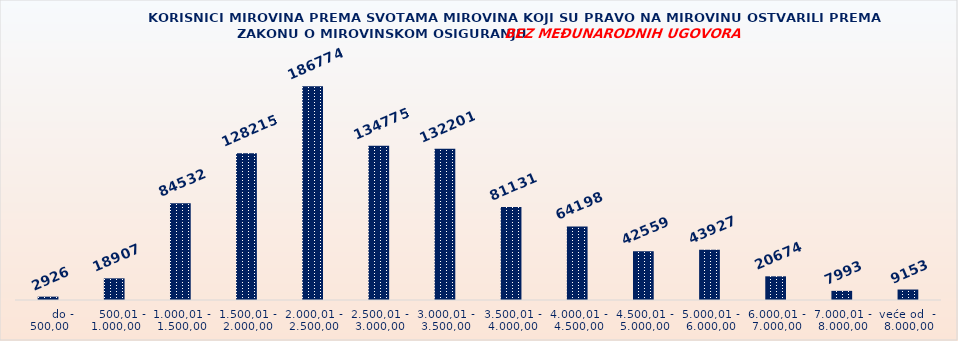
| Category | KORISNICI MIROVINA PREMA VRSTAMA I SVOTAMA MIROVINA KOJI SU PRAVO NA MIROVINU OSTVARILI PREMA ZAKONU O MIROVINSKOM OSIGURANJU 
BEZ MEĐUNARODNIH UGOVORA |
|---|---|
|       do - 500,00 | 2926 |
|    500,01 - 1.000,00 | 18907 |
| 1.000,01 - 1.500,00 | 84532 |
| 1.500,01 - 2.000,00 | 128215 |
| 2.000,01 - 2.500,00 | 186774 |
| 2.500,01 - 3.000,00 | 134775 |
| 3.000,01 - 3.500,00 | 132201 |
| 3.500,01 - 4.000,00 | 81131 |
| 4.000,01 - 4.500,00 | 64198 |
| 4.500,01 - 5.000,00 | 42559 |
| 5.000,01 - 6.000,00 | 43927 |
| 6.000,01 - 7.000,00 | 20674 |
| 7.000,01 - 8.000,00 | 7993 |
| veće od  -  8.000,00 | 9153 |